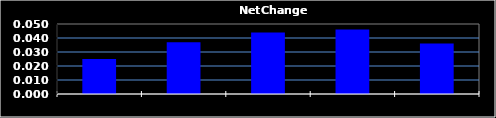
| Category | Series 0 |
|---|---|
| 0 | 0.025 |
| 1 | 0.037 |
| 2 | 0.044 |
| 3 | 0.046 |
| 4 | 0.036 |